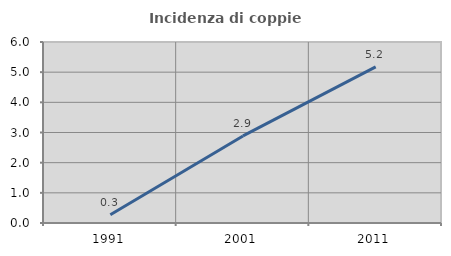
| Category | Incidenza di coppie miste |
|---|---|
| 1991.0 | 0.273 |
| 2001.0 | 2.886 |
| 2011.0 | 5.175 |